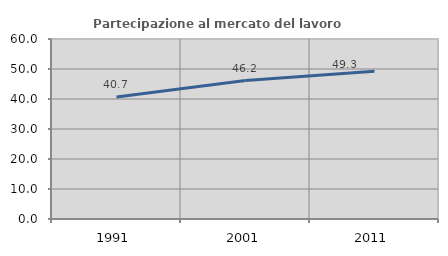
| Category | Partecipazione al mercato del lavoro  femminile |
|---|---|
| 1991.0 | 40.673 |
| 2001.0 | 46.16 |
| 2011.0 | 49.254 |